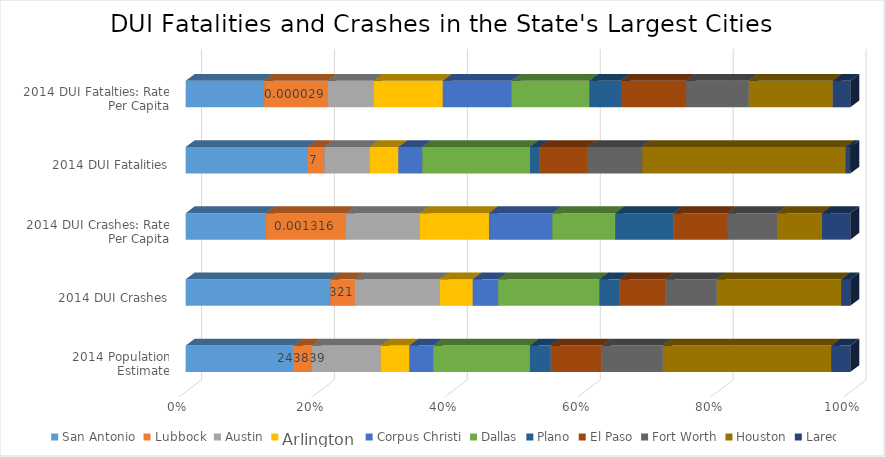
| Category | San Antonio | Lubbock | Austin | Arlington | Corpus Christi | Dallas | Plano | El Paso | Fort Worth | Houston | Laredo |
|---|---|---|---|---|---|---|---|---|---|---|---|
| 2014 Population Estimate | 1436697 | 243839 | 912791 | 383204 | 320434 | 1281047 | 278480 | 679036 | 812238 | 2239558 | 252309 |
| 2014 DUI Crashes | 1900 | 321 | 1110 | 436 | 334 | 1329 | 267 | 599 | 674 | 1633 | 118 |
| 2014 DUI Crashes: Rate Per Capita | 0.001 | 0.001 | 0.001 | 0.001 | 0.001 | 0.001 | 0.001 | 0.001 | 0.001 | 0.001 | 0 |
| 2014 DUI Fatalities | 51 | 7 | 19 | 12 | 10 | 45 | 4 | 20 | 23 | 85 | 2 |
| 2014 DUI Fatalties: Rate Per Capita | 0 | 0 | 0 | 0 | 0 | 0 | 0 | 0 | 0 | 0 | 0 |